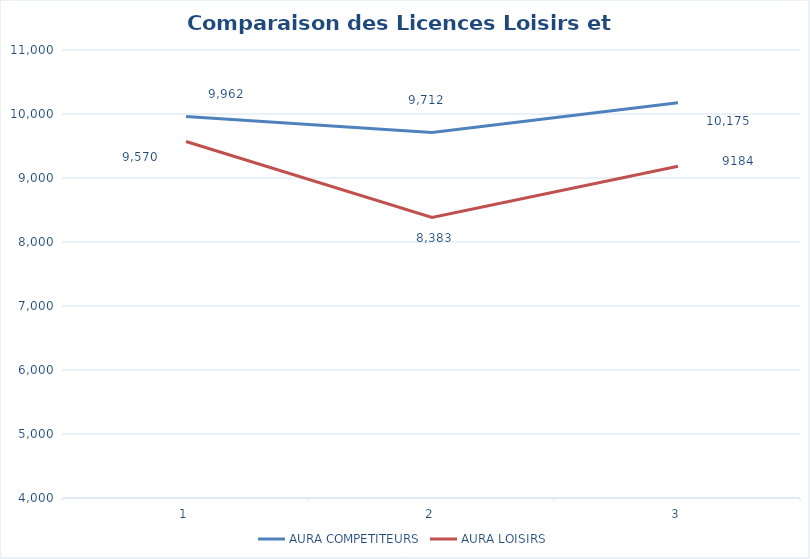
| Category | AURA COMPETITEURS | AURA LOISIRS |
|---|---|---|
| 0 | 9962 | 9570 |
| 1 | 9712 | 8383 |
| 2 | 10175 | 9184 |